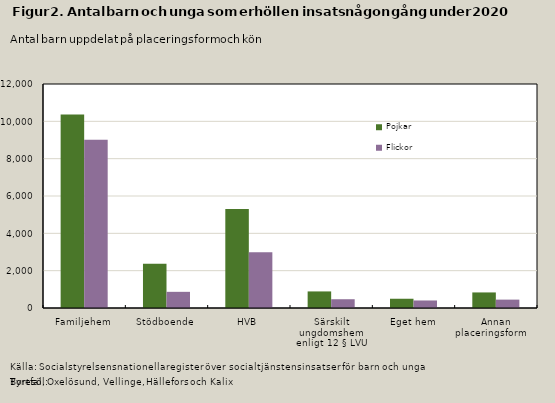
| Category | Pojkar | Flickor |
|---|---|---|
| Familjehem | 10370 | 9016 |
| Stödboende | 2370 | 866 |
| HVB | 5306 | 2987 |
| Särskilt ungdomshem enligt 12 § LVU | 888 | 470 |
| Eget hem | 496 | 403 |
| Annan placeringsform        | 834 | 449 |